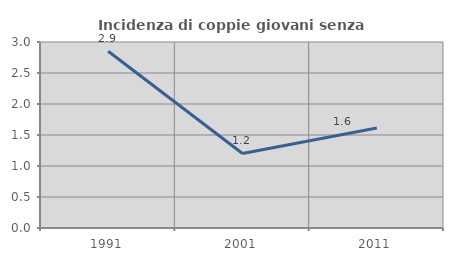
| Category | Incidenza di coppie giovani senza figli |
|---|---|
| 1991.0 | 2.85 |
| 2001.0 | 1.202 |
| 2011.0 | 1.613 |